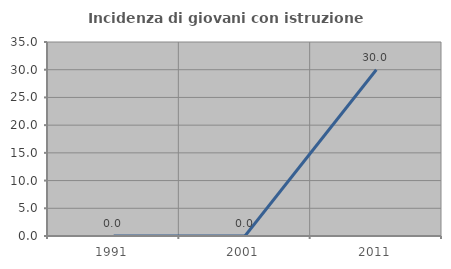
| Category | Incidenza di giovani con istruzione universitaria |
|---|---|
| 1991.0 | 0 |
| 2001.0 | 0 |
| 2011.0 | 30 |